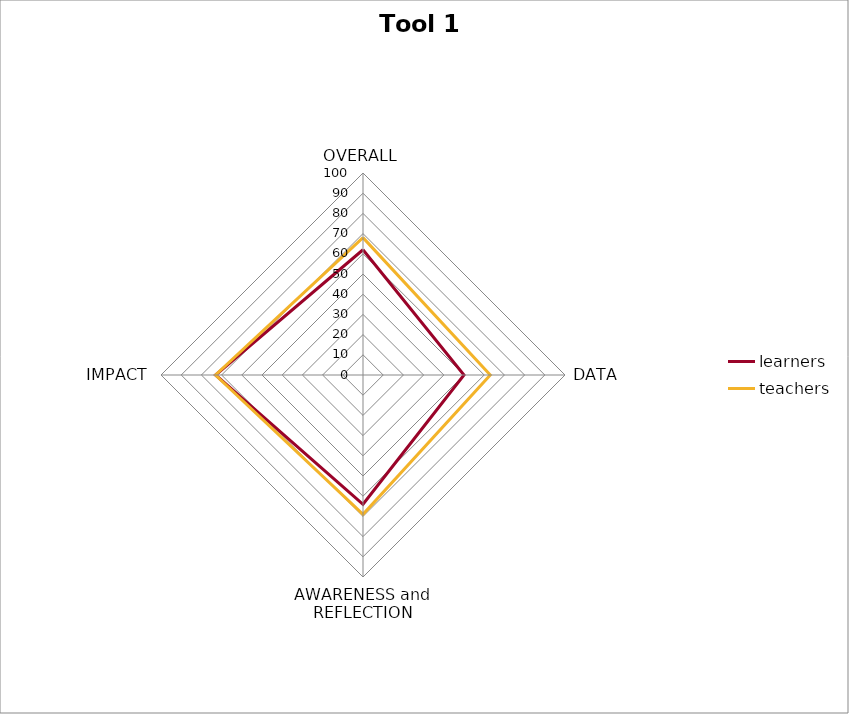
| Category | learners | teachers |
|---|---|---|
| OVERALL | 62 | 68 |
| DATA | 50 | 63 |
| AWARENESS and REFLECTION | 64 | 69 |
| IMPACT | 73 | 73 |